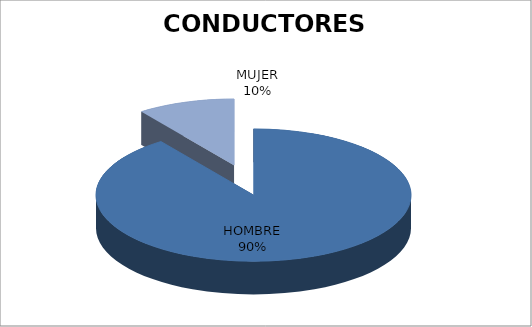
| Category | E.E. |
|---|---|
| HOMBRE | 27 |
| MUJER | 3 |